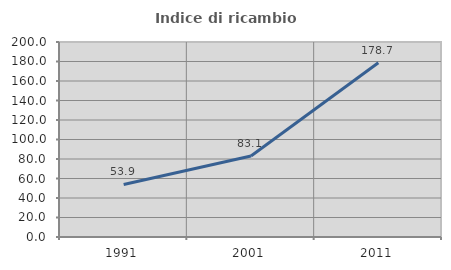
| Category | Indice di ricambio occupazionale  |
|---|---|
| 1991.0 | 53.906 |
| 2001.0 | 83.122 |
| 2011.0 | 178.652 |